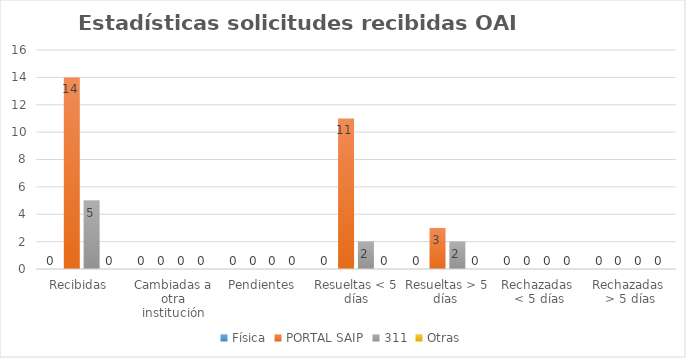
| Category | Física | PORTAL SAIP | 311 | Otras |
|---|---|---|---|---|
| Recibidas  | 0 | 14 | 5 | 0 |
| Cambiadas a otra institución | 0 | 0 | 0 | 0 |
| Pendientes  | 0 | 0 | 0 | 0 |
| Resueltas < 5 días | 0 | 11 | 2 | 0 |
| Resueltas > 5 días  | 0 | 3 | 2 | 0 |
| Rechazadas  < 5 días | 0 | 0 | 0 | 0 |
| Rechazadas  > 5 días | 0 | 0 | 0 | 0 |